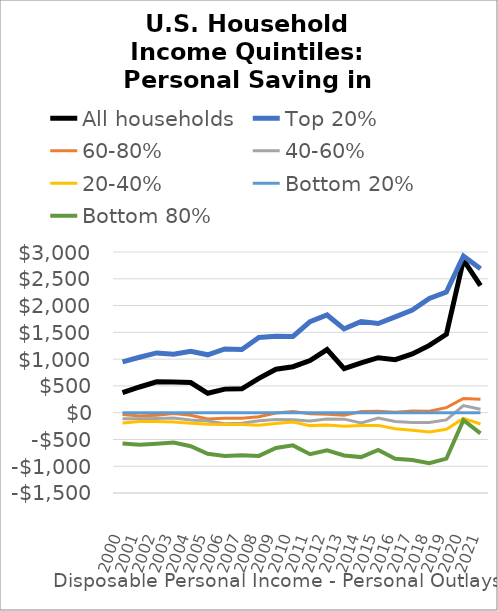
| Category | All households | Top 20% | 60-80% | 40-60% | 20-40% | Bottom 20% | Bottom 80% |
|---|---|---|---|---|---|---|---|
| 2000.0 | 373.479 | 947.34 | -35.466 | -112.315 | -194.769 | -0.526 | -573.861 |
| 2001.0 | 479.25 | 1034.78 | -61.727 | -112.245 | -166.859 | -0.557 | -598.112 |
| 2002.0 | 575.621 | 1115.85 | -46.797 | -107.859 | -165.182 | -0.55 | -578.568 |
| 2003.0 | 571.015 | 1089.674 | -16.75 | -100.489 | -174.429 | -0.552 | -556.717 |
| 2004.0 | 562.898 | 1145.859 | -48.808 | -137.106 | -195.623 | -0.478 | -625.6 |
| 2005.0 | 361.877 | 1080.705 | -116.722 | -155.164 | -217.957 | -0.527 | -768.095 |
| 2006.0 | 439.573 | 1190.796 | -102.821 | -205.605 | -219.88 | -0.476 | -809.174 |
| 2007.0 | 446.109 | 1178.974 | -104.253 | -195.855 | -220.838 | -0.437 | -793.146 |
| 2008.0 | 639.342 | 1402.533 | -76.227 | -152.467 | -233.229 | -0.533 | -807.638 |
| 2009.0 | 811.774 | 1426.381 | -6.663 | -126.292 | -201.894 | -0.497 | -660.405 |
| 2010.0 | 858.013 | 1424.372 | 19.457 | -133.888 | -175.05 | -0.469 | -611.03 |
| 2011.0 | 972.045 | 1700.612 | -19.832 | -156.434 | -241.894 | -0.508 | -776.234 |
| 2012.0 | 1177.822 | 1824.779 | -30.006 | -117.614 | -228.382 | -0.446 | -703.735 |
| 2013.0 | 822.439 | 1564.627 | -49.406 | -121.2 | -253.129 | -0.511 | -800.336 |
| 2014.0 | 931.217 | 1702.272 | 23.354 | -193.565 | -240.847 | -0.557 | -829.774 |
| 2015.0 | 1026.271 | 1665.772 | 24.657 | -99.58 | -237.811 | -0.465 | -694.455 |
| 2016.0 | 989.098 | 1789.553 | 9.06 | -165.634 | -301.615 | -0.473 | -860.513 |
| 2017.0 | 1096.161 | 1915.389 | 32.773 | -182.066 | -329.231 | -0.461 | -884.267 |
| 2018.0 | 1255.677 | 2132.843 | 25.135 | -183.148 | -359.833 | -0.462 | -944.369 |
| 2019.0 | 1462.738 | 2253.076 | 94.699 | -134.575 | -310.722 | -0.529 | -859.094 |
| 2020.0 | 2851.87 | 2924.629 | 264.335 | 132.54 | -106.854 | -0.403 | -139.323 |
| 2021.0 | 2371.989 | 2688.767 | 250.752 | 64.68 | -211.544 | -0.417 | -386.535 |